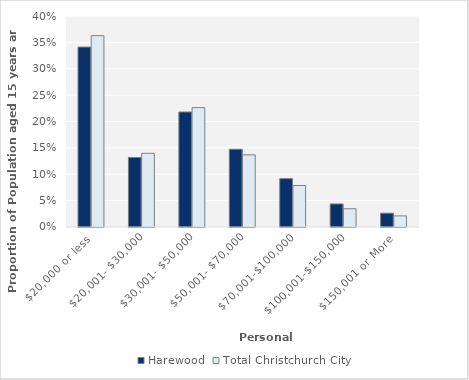
| Category | Harewood | Total Christchurch City |
|---|---|---|
| $20,000 or less | 0.341 | 0.363 |
| $20,001- $30,000 | 0.132 | 0.14 |
| $30,001- $50,000 | 0.218 | 0.226 |
| $50,001- $70,000 | 0.147 | 0.137 |
| $70,001-$100,000 | 0.092 | 0.079 |
| $100,001-$150,000 | 0.044 | 0.035 |
| $150,001 or More | 0.026 | 0.021 |